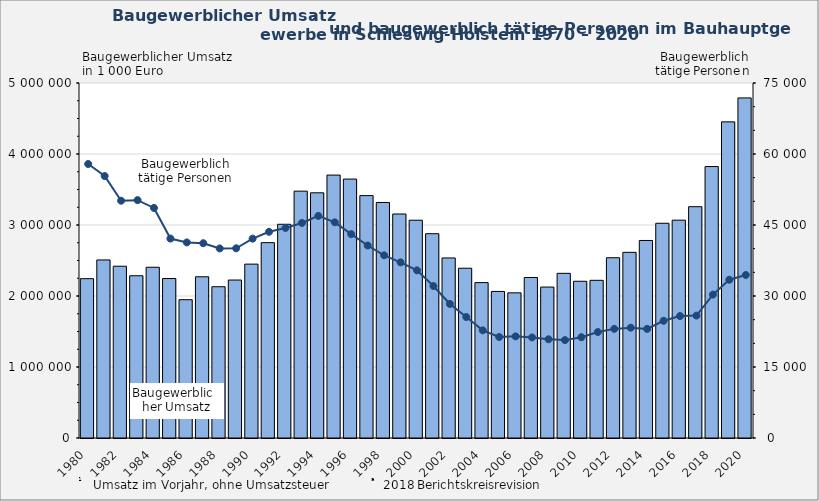
| Category | Baugewerblicher 
Umsatz in 1000 Euro |
|---|---|
| 1980.0 | 2243938 |
| 1981.0 | 2507741 |
| 1982.0 | 2419292 |
| 1983.0 | 2285011 |
| 1984.0 | 2404975 |
| 1985.0 | 2245931 |
| 1986.0 | 1947650 |
| 1987.0 | 2270584 |
| 1988.0 | 2130717 |
| 1989.0 | 2224899 |
| 1990.0 | 2449116 |
| 1991.0 | 2751377 |
| 1992.0 | 3010338 |
| 1993.0 | 3476875 |
| 1994.0 | 3453560 |
| 1995.0 | 3703125 |
| 1996.0 | 3646830 |
| 1997.0 | 3414109 |
| 1998.0 | 3317273 |
| 1999.0 | 3154963 |
| 2000.0 | 3067211 |
| 2001.0 | 2877358 |
| 2002.0 | 2536088 |
| 2003.0 | 2391237 |
| 2004.0 | 2188519 |
| 2005.0 | 2064179 |
| 2006.0 | 2044588 |
| 2007.0 | 2260543 |
| 2008.0 | 2125896 |
| 2009.0 | 2319249 |
| 2010.0 | 2207465 |
| 2011.0 | 2220922 |
| 2012.0 | 2538836 |
| 2013.0 | 2615095 |
| 2014.0 | 2781930 |
| 2015.0 | 3024321 |
| 2016.0 | 3068162 |
| 2017.0 | 3257770 |
| 2018.0 | 3823207 |
| 2019.0 | 4452522 |
| 2020.0 | 4789743 |